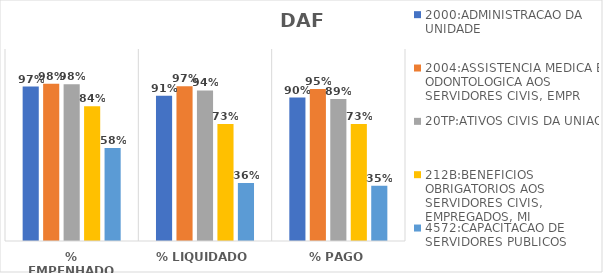
| Category | 2000:ADMINISTRACAO DA UNIDADE | 2004:ASSISTENCIA MEDICA E ODONTOLOGICA AOS SERVIDORES CIVIS, EMPR | 20TP:ATIVOS CIVIS DA UNIAO | 212B:BENEFICIOS OBRIGATORIOS AOS SERVIDORES CIVIS, EMPREGADOS, MI | 4572:CAPACITACAO DE SERVIDORES PUBLICOS FEDERAIS EM PROCESSO DE Q |
|---|---|---|---|---|---|
| % EMPENHADO | 0.965 | 0.982 | 0.98 | 0.842 | 0.582 |
| % LIQUIDADO | 0.907 | 0.968 | 0.941 | 0.732 | 0.363 |
| % PAGO | 0.897 | 0.95 | 0.887 | 0.731 | 0.345 |